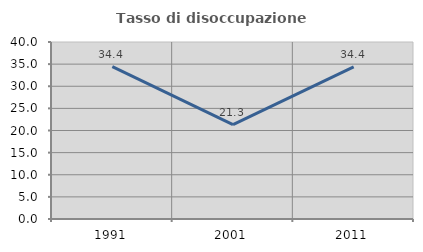
| Category | Tasso di disoccupazione giovanile  |
|---|---|
| 1991.0 | 34.421 |
| 2001.0 | 21.333 |
| 2011.0 | 34.375 |